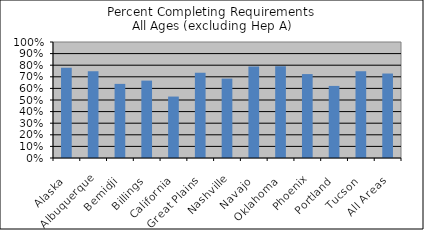
| Category | % Comp. Req. |
|---|---|
| Alaska | 0.779 |
| Albuquerque | 0.749 |
| Bemidji | 0.639 |
| Billings | 0.667 |
| California | 0.53 |
| Great Plains | 0.735 |
| Nashville | 0.685 |
| Navajo | 0.789 |
| Oklahoma | 0.79 |
| Phoenix | 0.723 |
| Portland | 0.621 |
| Tucson | 0.749 |
| All Areas | 0.728 |